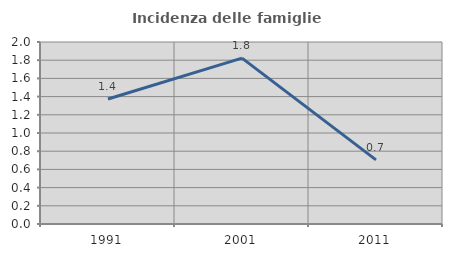
| Category | Incidenza delle famiglie numerose |
|---|---|
| 1991.0 | 1.374 |
| 2001.0 | 1.822 |
| 2011.0 | 0.704 |